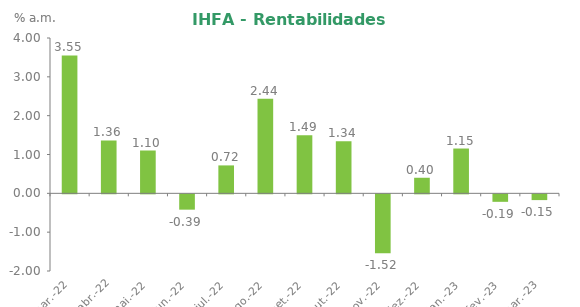
| Category | Series 0 |
|---|---|
| 2022-03-31 | 3.55 |
| 2022-04-29 | 1.363 |
| 2022-05-31 | 1.103 |
| 2022-06-30 | -0.395 |
| 2022-07-29 | 0.719 |
| 2022-08-31 | 2.435 |
| 2022-09-30 | 1.494 |
| 2022-10-31 | 1.344 |
| 2022-11-30 | -1.517 |
| 2022-12-30 | 0.401 |
| 2023-01-31 | 1.154 |
| 2023-02-28 | -0.193 |
| 2023-03-31 | -0.148 |